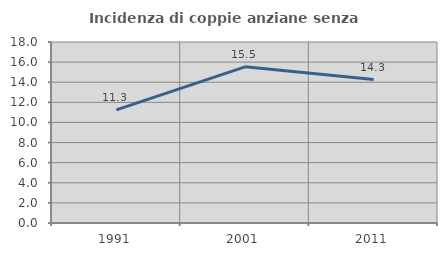
| Category | Incidenza di coppie anziane senza figli  |
|---|---|
| 1991.0 | 11.255 |
| 2001.0 | 15.531 |
| 2011.0 | 14.266 |